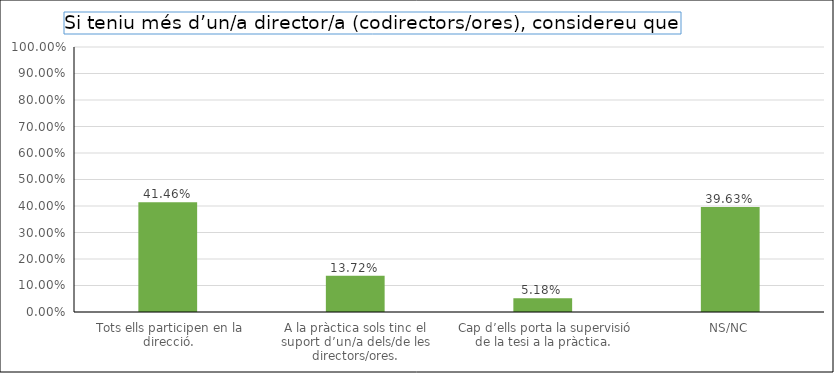
| Category | Series 0 |
|---|---|
|  Tots ells participen en la direcció. | 0.415 |
| A la pràctica sols tinc el suport d’un/a dels/de les directors/ores. | 0.137 |
|  Cap d’ells porta la supervisió de la tesi a la pràctica. | 0.052 |
| NS/NC | 0.396 |